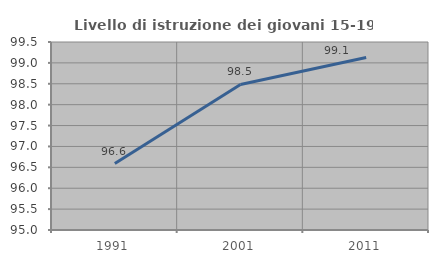
| Category | Livello di istruzione dei giovani 15-19 anni |
|---|---|
| 1991.0 | 96.591 |
| 2001.0 | 98.485 |
| 2011.0 | 99.13 |